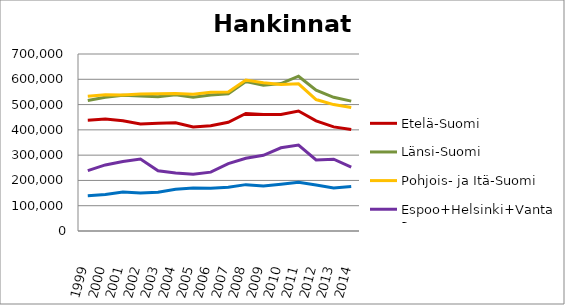
| Category | Etelä-Suomi | Länsi-Suomi | Pohjois- ja Itä-Suomi | Espoo+Helsinki+Vantaa | Muu Uusimaa |
|---|---|---|---|---|---|
| 1999.0 | 438318 | 516392 | 532828 | 238818 | 139634 |
| 2000.0 | 442624 | 529062 | 539210 | 261301 | 144634 |
| 2001.0 | 436162 | 537191 | 537979 | 274785 | 153861 |
| 2002.0 | 423397 | 534347 | 541733 | 284671 | 150104 |
| 2003.0 | 425951 | 530715 | 542845 | 237831 | 152975 |
| 2004.0 | 428337 | 538767 | 544014 | 229014 | 165390 |
| 2005.0 | 411710 | 529342 | 540443 | 224094 | 169938 |
| 2006.0 | 415940 | 538195 | 548636 | 232846 | 169103 |
| 2007.0 | 430086 | 543067 | 550145 | 266289 | 172940 |
| 2008.0 | 464879 | 591194 | 596960 | 287735 | 183358 |
| 2009.0 | 460453 | 576517 | 586541 | 299296 | 177799 |
| 2010.0 | 460373 | 583178 | 578934 | 329100 | 185045 |
| 2011.0 | 474678 | 612052 | 581939 | 339560 | 192443 |
| 2012.0 | 435674 | 556879 | 519905 | 280899 | 181903 |
| 2013.0 | 411823 | 528599 | 500017 | 283868 | 170552 |
| 2014.0 | 401038 | 513604 | 488319 | 253076 | 176291 |